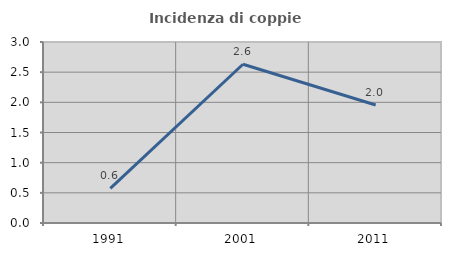
| Category | Incidenza di coppie miste |
|---|---|
| 1991.0 | 0.575 |
| 2001.0 | 2.632 |
| 2011.0 | 1.955 |